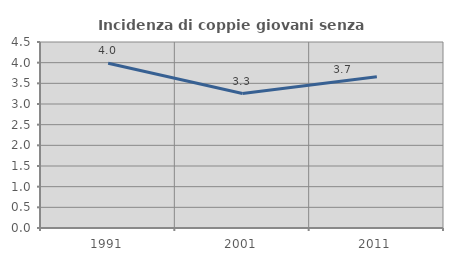
| Category | Incidenza di coppie giovani senza figli |
|---|---|
| 1991.0 | 3.984 |
| 2001.0 | 3.252 |
| 2011.0 | 3.659 |